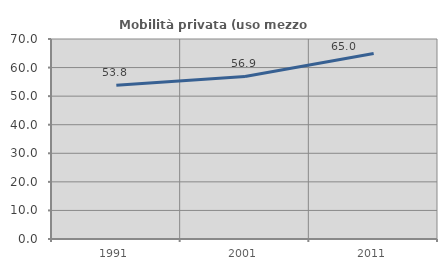
| Category | Mobilità privata (uso mezzo privato) |
|---|---|
| 1991.0 | 53.821 |
| 2001.0 | 56.882 |
| 2011.0 | 64.955 |